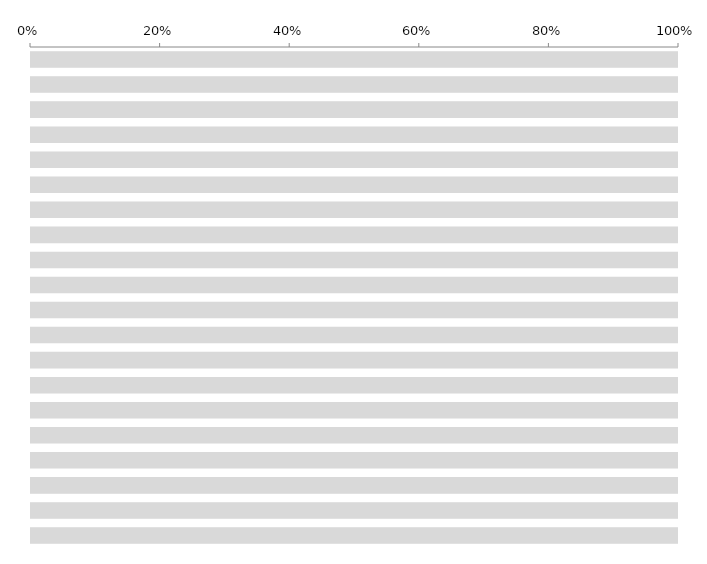
| Category | % YES | % NO | % UNANSWERED |
|---|---|---|---|
| PRODUCTION  | 0 | 0 | 1 |
| ACCOUNTING  | 0 | 0 | 1 |
| ART | 0 | 0 | 1 |
| ASSISTANT DIRECTORS | 0 | 0 | 1 |
| CAMERA | 0 | 0 | 1 |
| CATERING | 0 | 0 | 1 |
| CONSTRUCTION | 0 | 0 | 1 |
| COSTUME/WARDROBE | 0 | 0 | 1 |
| CRAFT SERVICE | 0 | 0 | 1 |
| ELECTRIC | 0 | 0 | 1 |
| GREEN | 0 | 0 | 1 |
| GRIP | 0 | 0 | 1 |
| HAIR | 0 | 0 | 1 |
| LOCATION | 0 | 0 | 1 |
| MAKE UP | 0 | 0 | 1 |
| PROP | 0 | 0 | 1 |
| SET DECORATION | 0 | 0 | 1 |
| SPECIAL EFFECTS | 0 | 0 | 1 |
| SOUND | 0 | 0 | 1 |
| TRANSPORTATION | 0 | 0 | 1 |